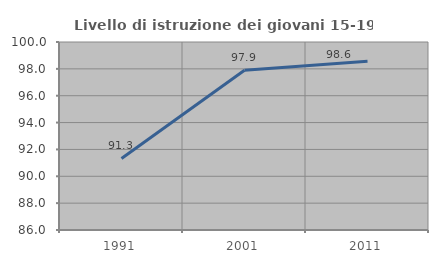
| Category | Livello di istruzione dei giovani 15-19 anni |
|---|---|
| 1991.0 | 91.329 |
| 2001.0 | 97.895 |
| 2011.0 | 98.558 |